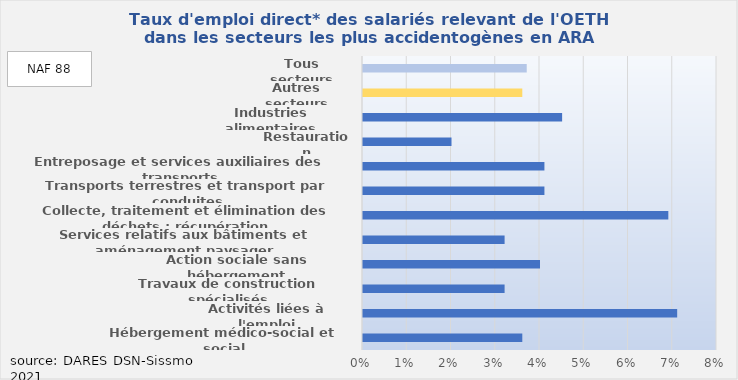
| Category | Series 0 |
|---|---|
| Hébergement médico-social et social | 0.036 |
| Activités liées à l'emploi | 0.071 |
| Travaux de construction spécialisés | 0.032 |
| Action sociale sans hébergement | 0.04 |
| Services relatifs aux bâtiments et aménagement paysager | 0.032 |
| Collecte, traitement et élimination des déchets ; récupération | 0.069 |
| Transports terrestres et transport par conduites | 0.041 |
| Entreposage et services auxiliaires des transports | 0.041 |
| Restauration | 0.02 |
| Industries alimentaires | 0.045 |
| Autres secteurs | 0.036 |
| Tous secteurs | 0.037 |